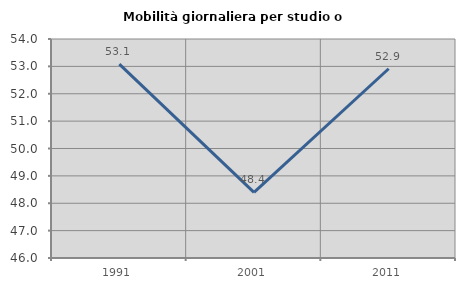
| Category | Mobilità giornaliera per studio o lavoro |
|---|---|
| 1991.0 | 53.08 |
| 2001.0 | 48.398 |
| 2011.0 | 52.914 |